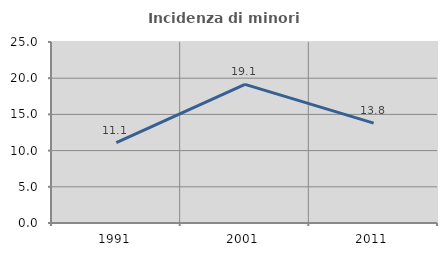
| Category | Incidenza di minori stranieri |
|---|---|
| 1991.0 | 11.111 |
| 2001.0 | 19.149 |
| 2011.0 | 13.793 |